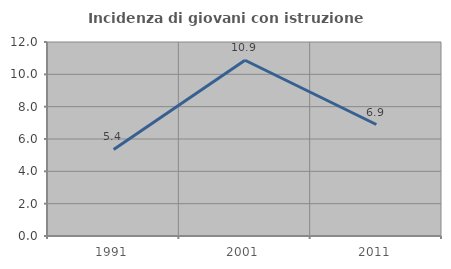
| Category | Incidenza di giovani con istruzione universitaria |
|---|---|
| 1991.0 | 5.357 |
| 2001.0 | 10.87 |
| 2011.0 | 6.897 |